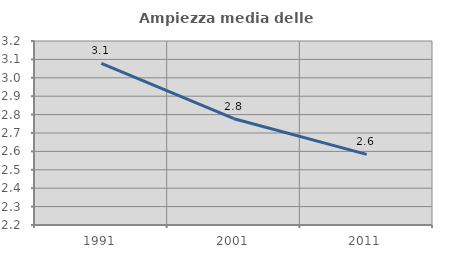
| Category | Ampiezza media delle famiglie |
|---|---|
| 1991.0 | 3.079 |
| 2001.0 | 2.778 |
| 2011.0 | 2.584 |